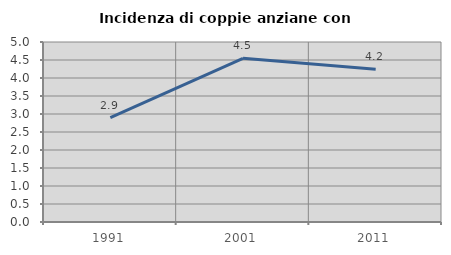
| Category | Incidenza di coppie anziane con figli |
|---|---|
| 1991.0 | 2.899 |
| 2001.0 | 4.545 |
| 2011.0 | 4.242 |